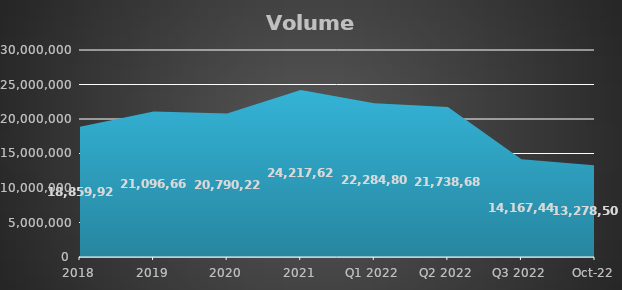
| Category | Metric Tons |
|---|---|
| 2018 | 18859924 |
| 2019 | 21096664 |
| 2020 | 20790224 |
| 2021 | 24217622 |
| Q1 2022 | 22284809 |
| Q2 2022 | 21738684 |
| Q3 2022 | 14167444.712 |
| Oct-22 | 13278502.288 |